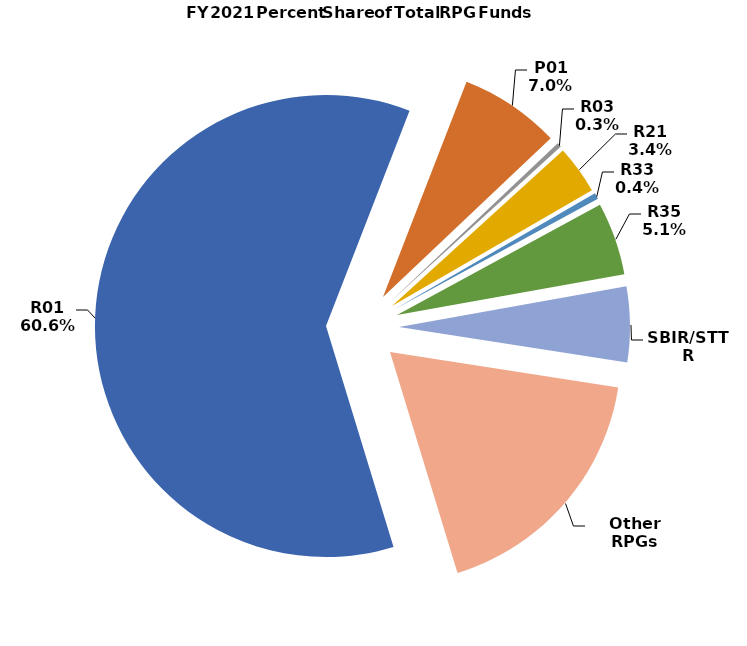
| Category | Series 1 |
|---|---|
| R01 | 0.606 |
| P01 | 0.07 |
| R03 | 0.003 |
| R21 | 0.034 |
| R33 | 0.004 |
| R35 | 0.051 |
| SBIR/STTR | 0.053 |
| Other RPGs | 0.178 |